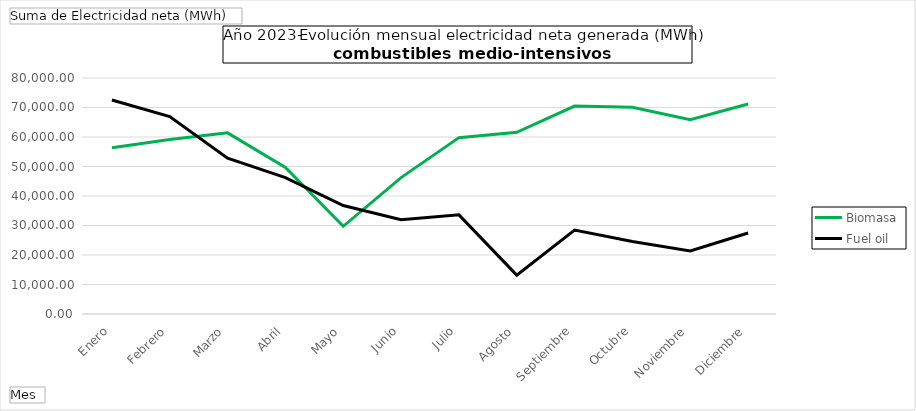
| Category | Biomasa | Fuel oil |
|---|---|---|
| Enero | 56326.81 | 72552.17 |
| Febrero | 59170.32 | 66938.55 |
| Marzo | 61396.84 | 52789.05 |
| Abril | 49648.57 | 46207.82 |
| Mayo | 29720.57 | 36767.05 |
| Junio | 46241.79 | 31984.46 |
| Julio | 59783.2 | 33612.21 |
| Agosto | 61596.63 | 13178.72 |
| Septiembre | 70503.65 | 28479.33 |
| Octubre | 70055.82 | 24555.01 |
| Noviembre | 65836.22 | 21404.63 |
| Diciembre | 71171.97 | 27468.68 |